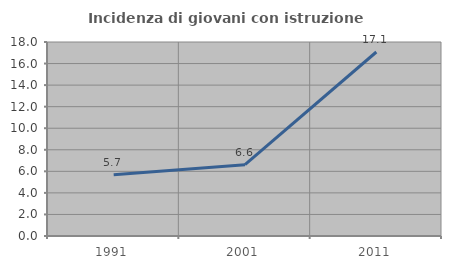
| Category | Incidenza di giovani con istruzione universitaria |
|---|---|
| 1991.0 | 5.693 |
| 2001.0 | 6.613 |
| 2011.0 | 17.073 |